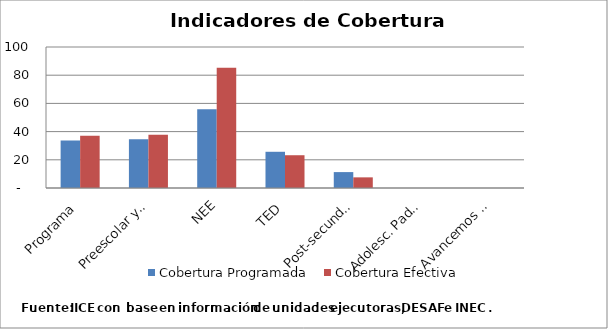
| Category | Cobertura Programada | Cobertura Efectiva |
|---|---|---|
| Programa | 33.621 | 37.062 |
| Preescolar y Primaria | 34.505 | 37.835 |
| NEE | 55.841 | 85.278 |
| TED | 25.687 | 23.242 |
| Post-secundaria Regular | 11.281 | 7.546 |
| Adolesc. Padres y Madres | 0 | 0 |
| Avancemos más | 0 | 0 |